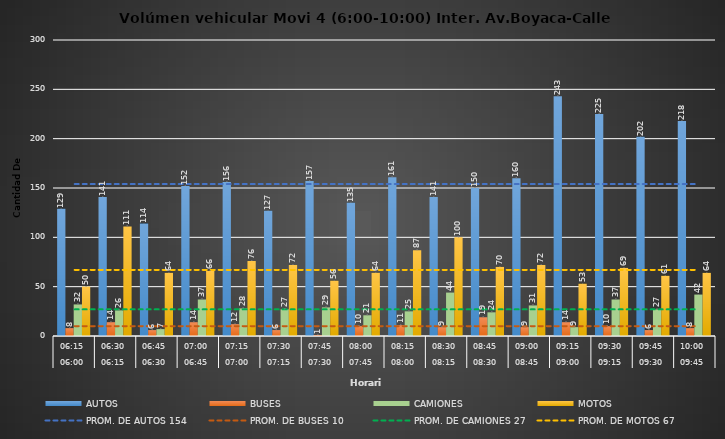
| Category | AUTOS | BUSES | CAMIONES | MOTOS |
|---|---|---|---|---|
| 0 | 129 | 8 | 32 | 50 |
| 1 | 141 | 14 | 26 | 111 |
| 2 | 114 | 6 | 7 | 64 |
| 3 | 152 | 14 | 37 | 66 |
| 4 | 156 | 12 | 28 | 76 |
| 5 | 127 | 6 | 27 | 72 |
| 6 | 157 | 1 | 29 | 56 |
| 7 | 135 | 10 | 21 | 64 |
| 8 | 161 | 11 | 25 | 87 |
| 9 | 141 | 9 | 44 | 100 |
| 10 | 150 | 19 | 24 | 70 |
| 11 | 160 | 9 | 31 | 72 |
| 12 | 243 | 14 | 9 | 53 |
| 13 | 225 | 10 | 37 | 69 |
| 14 | 202 | 6 | 27 | 61 |
| 15 | 218 | 8 | 42 | 64 |